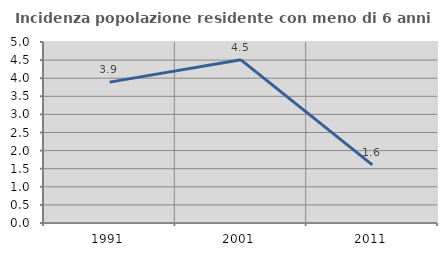
| Category | Incidenza popolazione residente con meno di 6 anni |
|---|---|
| 1991.0 | 3.892 |
| 2001.0 | 4.508 |
| 2011.0 | 1.604 |